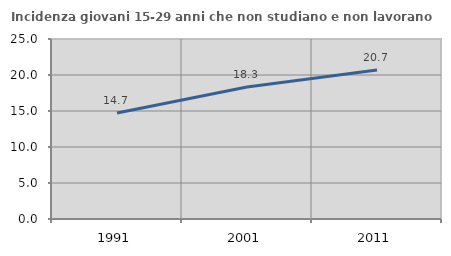
| Category | Incidenza giovani 15-29 anni che non studiano e non lavorano  |
|---|---|
| 1991.0 | 14.71 |
| 2001.0 | 18.333 |
| 2011.0 | 20.69 |